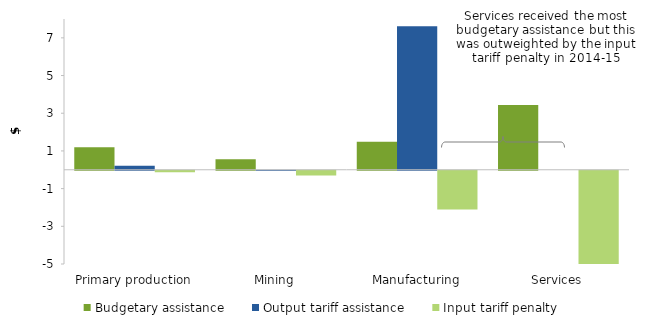
| Category | Budgetary assistance | Output tariff assistance | Input tariff penalty |
|---|---|---|---|
| Primary production | 1.198 | 0.209 | -0.084 |
| Mining | 0.552 | 0.001 | -0.254 |
| Manufacturing | 1.484 | 7.617 | -2.061 |
| Services | 3.431 | 0 | -5.125 |